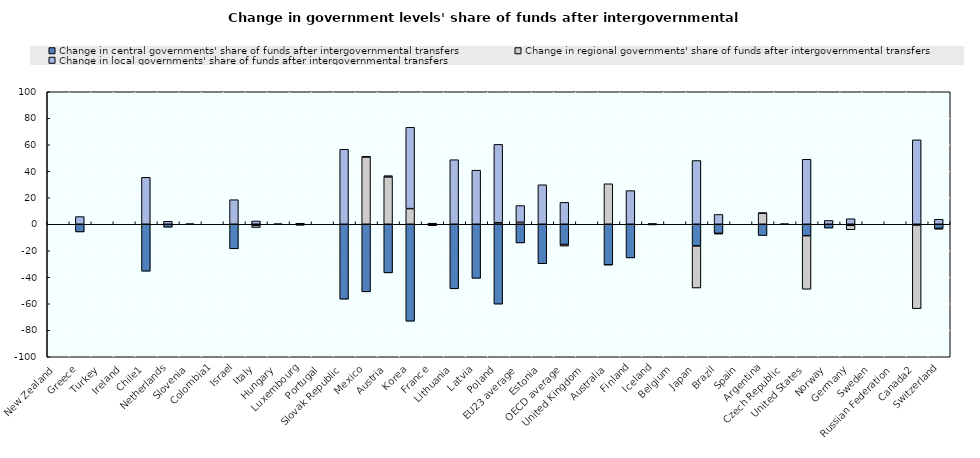
| Category | Change in central governments' share of funds after intergovernmental transfers | Change in regional governments' share of funds after intergovernmental transfers | Change in local governments' share of funds after intergovernmental transfers |
|---|---|---|---|
| New Zealand | 0 | 0 | 0 |
| Greece | -5.808 | 0 | 5.808 |
| Turkey | 0 | 0 | 0 |
| Ireland | 0 | 0 | 0 |
| Chile1 | -35.448 | 0 | 35.448 |
| Netherlands | -2.243 | 0 | 2.243 |
| Slovenia | -0.079 | 0 | 0.079 |
| Colombia1 | 0 | 0 | 0 |
| Israel | -18.537 | 0 | 18.537 |
| Italy | -0.849 | -1.62 | 2.469 |
| Hungary | -0.24 | 0 | 0.24 |
| Luxembourg | -0.767 | 0 | 0.767 |
| Portugal | 0 | 0 | 0 |
| Slovak Republic | -56.58 | 0 | 56.58 |
| Mexico | -51.007 | 50.913 | 0.094 |
| Austria | -36.696 | 35.645 | 1.051 |
| Korea | -73.174 | 11.799 | 61.375 |
| France | -0.716 | -0.114 | 0.83 |
| Lithuania | -48.723 | 0 | 48.723 |
| Latvia | -40.833 | 0 | 40.833 |
| Poland | -60.291 | 1.148 | 59.144 |
| EU23 average | -14.097 | 1.455 | 12.642 |
| Estonia | -29.814 | 0 | 29.814 |
| OECD average | -15.303 | -1.215 | 16.519 |
| United Kingdom | 0 | 0 | 0 |
| Australia | -30.558 | 30.558 | 0 |
| Finland | -25.401 | 0 | 25.401 |
| Iceland | -0.511 | 0 | 0.511 |
| Belgium | 0 | 0 | 0 |
| Japan | -16.349 | -31.774 | 48.123 |
| Brazil | -6.889 | -0.506 | 7.394 |
| Spain | 0 | 0 | 0 |
| Argentina | -8.548 | 8.39 | 0.158 |
| Czech Republic | -0.29 | 0.29 | 0 |
| United States | -8.624 | -40.454 | 49.078 |
| Norway | -2.872 | 0 | 2.872 |
| Germany | -0.807 | -3.345 | 4.151 |
| Sweden | 0 | 0 | 0 |
| Russian Federation | 0 | 0 | 0 |
| Canada2 | -0.555 | -63.158 | 63.714 |
| Switzerland | -3.151 | -0.599 | 3.75 |